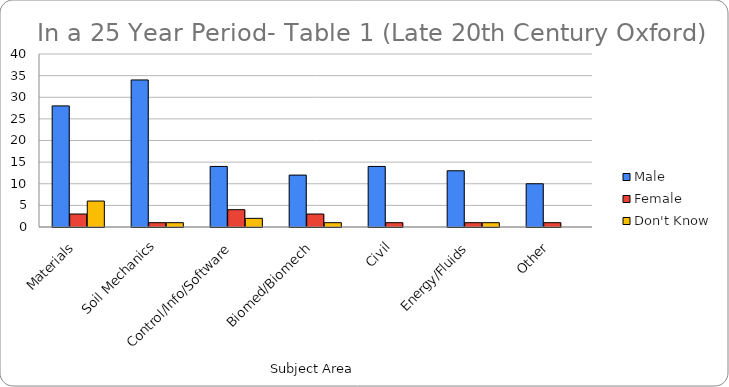
| Category | Male | Female | Don't Know |
|---|---|---|---|
| Materials | 28 | 3 | 6 |
| Soil Mechanics | 34 | 1 | 1 |
| Control/Info/Software | 14 | 4 | 2 |
| Biomed/Biomech | 12 | 3 | 1 |
| Civil | 14 | 1 | 0 |
| Energy/Fluids | 13 | 1 | 1 |
| Other | 10 | 1 | 0 |